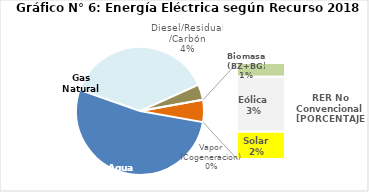
| Category | Series 0 |
|---|---|
| Agua | 2471.451 |
| Gas Natural | 1779.837 |
| Diesel/Residual/Carbón | 185.054 |
| Vapor (Cogeneracion) | 0.42 |
| Biomasa (BZ+BG) | 37.521 |
| Eólica | 150.476 |
| Solar | 74.919 |